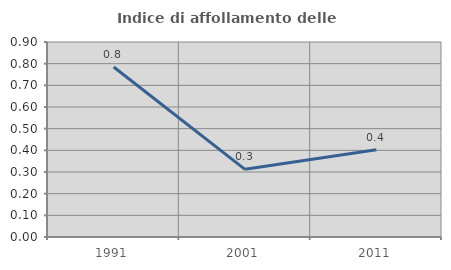
| Category | Indice di affollamento delle abitazioni  |
|---|---|
| 1991.0 | 0.785 |
| 2001.0 | 0.312 |
| 2011.0 | 0.403 |